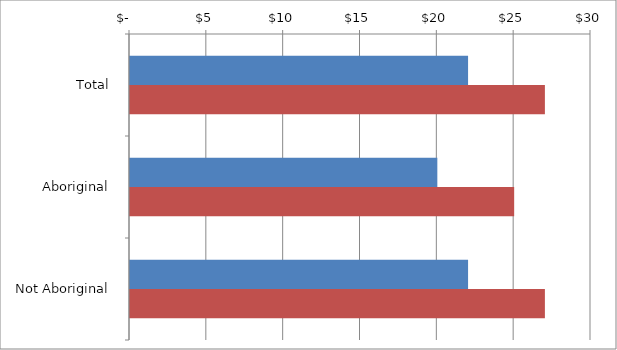
| Category | Series 0 | Series 1 |
|---|---|---|
| Total | 22 | 27 |
|  Aboriginal  | 20 | 25 |
|  Not Aboriginal  | 22 | 27 |